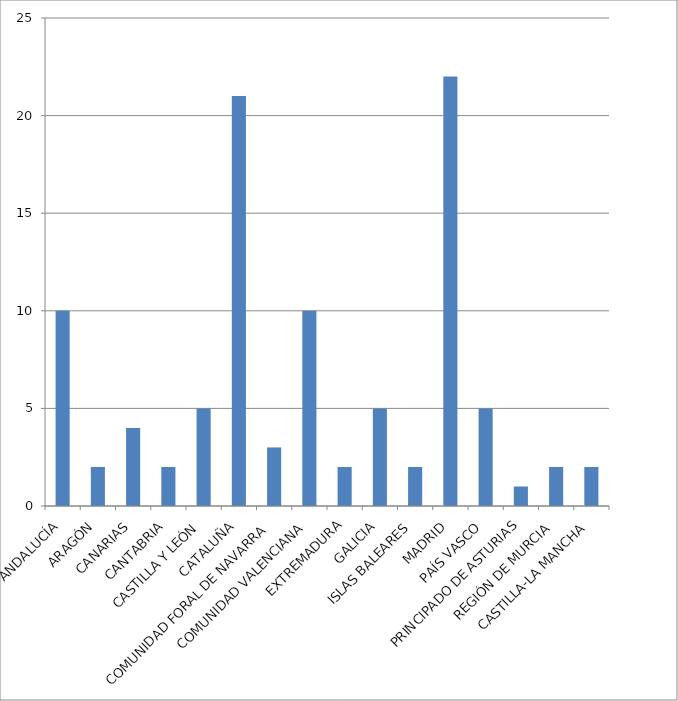
| Category | Total |
|---|---|
| ANDALUCÍA | 10 |
| ARAGÓN | 2 |
| CANARIAS | 4 |
| CANTABRIA | 2 |
| CASTILLA Y LEÓN | 5 |
| CATALUÑA | 21 |
| COMUNIDAD FORAL DE NAVARRA | 3 |
| COMUNIDAD VALENCIANA | 10 |
| EXTREMADURA | 2 |
| GALICIA | 5 |
| ISLAS BALEARES | 2 |
| MADRID | 22 |
| PAÍS VASCO | 5 |
| PRINCIPADO DE ASTURIAS | 1 |
| REGIÓN DE MURCIA | 2 |
| CASTILLA-LA MANCHA | 2 |